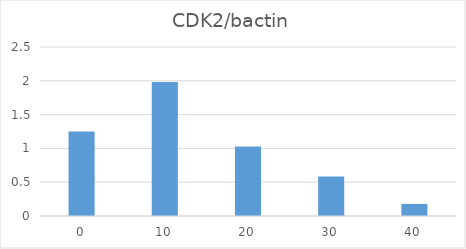
| Category | CDK2/bactin |
|---|---|
| 0.0 | 1.249 |
| 10.0 | 1.982 |
| 20.0 | 1.03 |
| 30.0 | 0.585 |
| 40.0 | 0.179 |